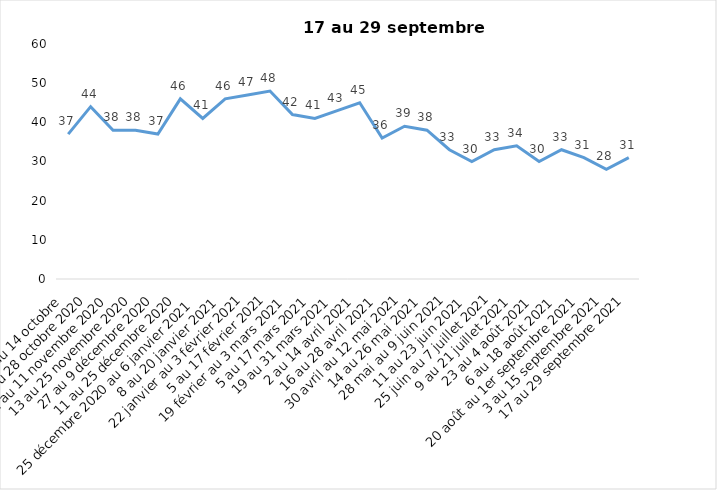
| Category | Toujours aux trois mesures |
|---|---|
| 2 au 14 octobre  | 37 |
| 16 au 28 octobre 2020 | 44 |
| 30 octobre au 11 novembre 2020 | 38 |
| 13 au 25 novembre 2020 | 38 |
| 27 au 9 décembre 2020 | 37 |
| 11 au 25 décembre 2020 | 46 |
| 25 décembre 2020 au 6 janvier 2021 | 41 |
| 8 au 20 janvier 2021 | 46 |
| 22 janvier au 3 février 2021 | 47 |
| 5 au 17 février 2021 | 48 |
| 19 février au 3 mars 2021 | 42 |
| 5 au 17 mars 2021 | 41 |
| 19 au 31 mars 2021 | 43 |
| 2 au 14 avril 2021 | 45 |
| 16 au 28 avril 2021 | 36 |
| 30 avril au 12 mai 2021 | 39 |
| 14 au 26 mai 2021 | 38 |
| 28 mai au 9 juin 2021 | 33 |
| 11 au 23 juin 2021 | 30 |
| 25 juin au 7 juillet 2021 | 33 |
| 9 au 21 juillet 2021 | 34 |
| 23 au 4 août 2021 | 30 |
| 6 au 18 août 2021 | 33 |
| 20 août au 1er septembre 2021 | 31 |
| 3 au 15 septembre 2021 | 28 |
| 17 au 29 septembre 2021 | 31 |